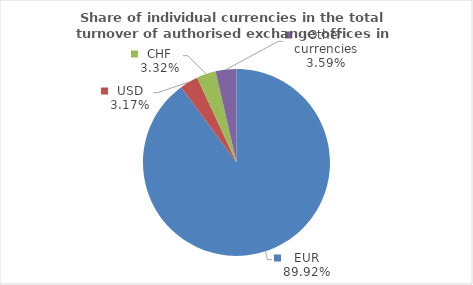
| Category | Series 0 |
|---|---|
| EUR | 89.917 |
| USD | 3.173 |
| CHF | 3.316 |
| Other currencies | 3.594 |